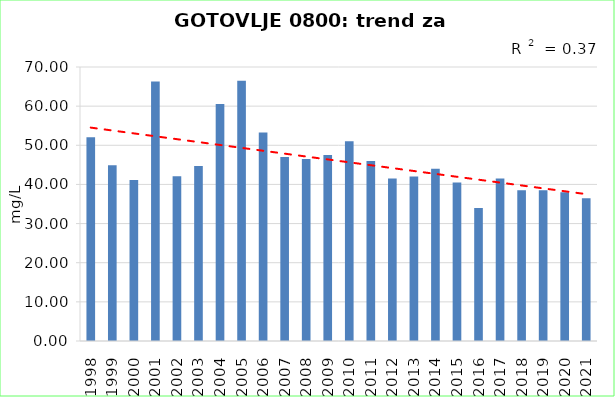
| Category | Vsota |
|---|---|
| 1998 | 52.05 |
| 1999 | 44.9 |
| 2000 | 41.1 |
| 2001 | 66.3 |
| 2002 | 42.1 |
| 2003 | 44.725 |
| 2004 | 60.533 |
| 2005 | 66.467 |
| 2006 | 53.25 |
| 2007 | 47 |
| 2008 | 46.5 |
| 2009 | 47.5 |
| 2010 | 51 |
| 2011 | 46 |
| 2012 | 41.5 |
| 2013 | 42 |
| 2014 | 44 |
| 2015 | 40.5 |
| 2016 | 34 |
| 2017 | 41.5 |
| 2018 | 38.5 |
| 2019 | 38.5 |
| 2020 | 38 |
| 2021 | 36.5 |